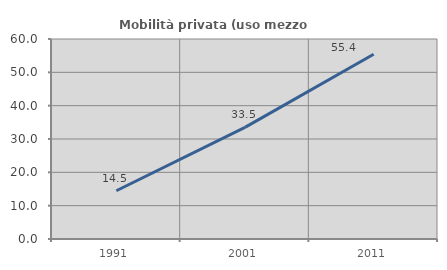
| Category | Mobilità privata (uso mezzo privato) |
|---|---|
| 1991.0 | 14.468 |
| 2001.0 | 33.503 |
| 2011.0 | 55.439 |